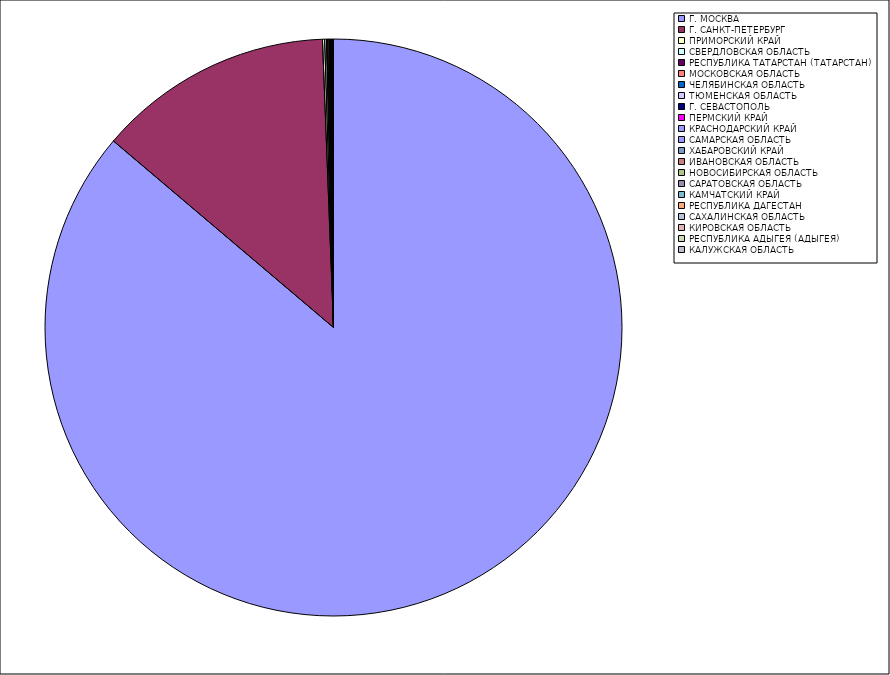
| Category | Оборот |
|---|---|
| Г. МОСКВА | 86.149 |
| Г. САНКТ-ПЕТЕРБУРГ | 13.196 |
| ПРИМОРСКИЙ КРАЙ | 0.119 |
| СВЕРДЛОВСКАЯ ОБЛАСТЬ | 0.099 |
| РЕСПУБЛИКА ТАТАРСТАН (ТАТАРСТАН) | 0.069 |
| МОСКОВСКАЯ ОБЛАСТЬ | 0.068 |
| ЧЕЛЯБИНСКАЯ ОБЛАСТЬ | 0.04 |
| ТЮМЕНСКАЯ ОБЛАСТЬ | 0.039 |
| Г. СЕВАСТОПОЛЬ | 0.032 |
| ПЕРМСКИЙ КРАЙ | 0.017 |
| КРАСНОДАРСКИЙ КРАЙ | 0.016 |
| САМАРСКАЯ ОБЛАСТЬ | 0.016 |
| ХАБАРОВСКИЙ КРАЙ | 0.015 |
| ИВАНОВСКАЯ ОБЛАСТЬ | 0.013 |
| НОВОСИБИРСКАЯ ОБЛАСТЬ | 0.011 |
| САРАТОВСКАЯ ОБЛАСТЬ | 0.011 |
| КАМЧАТСКИЙ КРАЙ | 0.009 |
| РЕСПУБЛИКА ДАГЕСТАН | 0.008 |
| САХАЛИНСКАЯ ОБЛАСТЬ | 0.008 |
| КИРОВСКАЯ ОБЛАСТЬ | 0.007 |
| РЕСПУБЛИКА АДЫГЕЯ (АДЫГЕЯ) | 0.006 |
| КАЛУЖСКАЯ ОБЛАСТЬ | 0.006 |